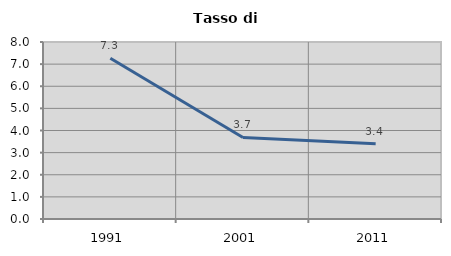
| Category | Tasso di disoccupazione   |
|---|---|
| 1991.0 | 7.263 |
| 2001.0 | 3.686 |
| 2011.0 | 3.401 |